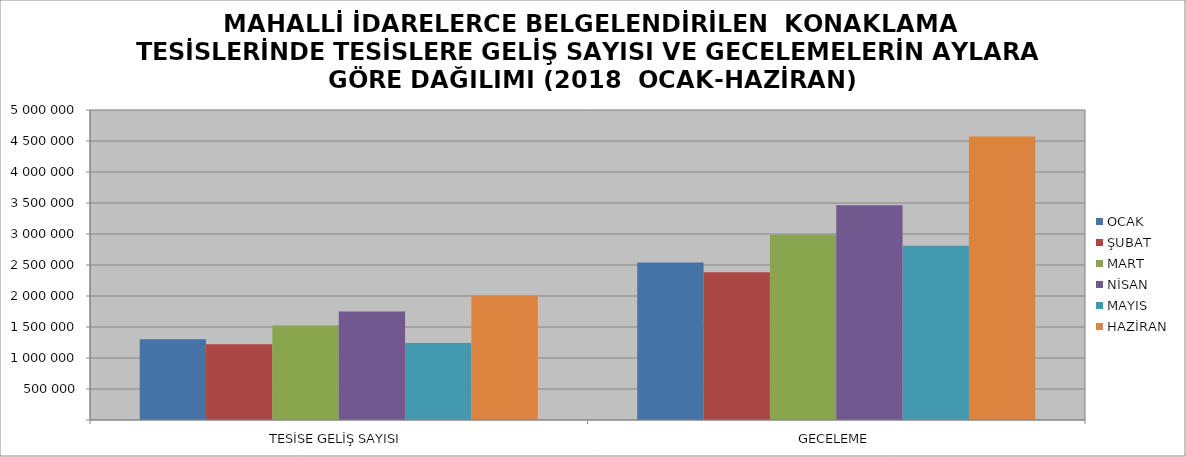
| Category | OCAK | ŞUBAT | MART | NİSAN | MAYIS | HAZİRAN |
|---|---|---|---|---|---|---|
| TESİSE GELİŞ SAYISI | 1303353 | 1223475 | 1526172 | 1749085 | 1240889 | 2003881 |
| GECELEME | 2542103 | 2381300 | 2986820 | 3463261 | 2810808 | 4572629 |